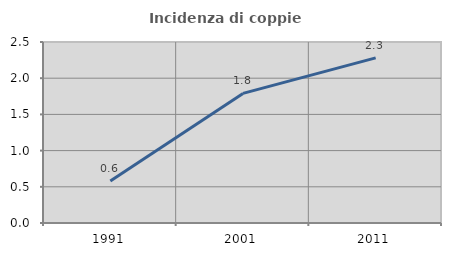
| Category | Incidenza di coppie miste |
|---|---|
| 1991.0 | 0.579 |
| 2001.0 | 1.79 |
| 2011.0 | 2.281 |